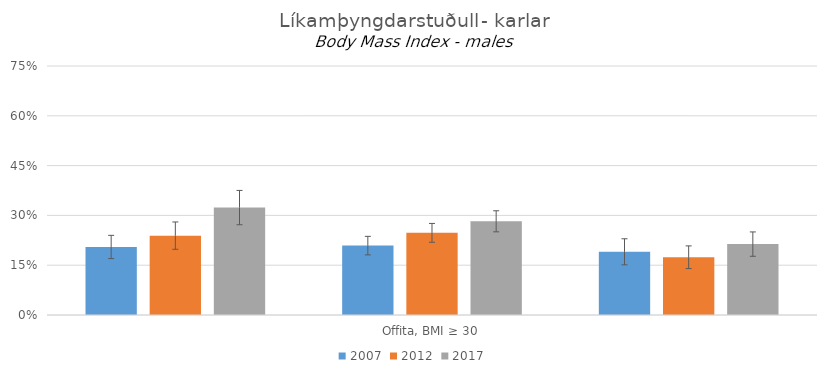
| Category | 2007 | 2012 | 2017 |
|---|---|---|---|
| 0 | 0.205 | 0.239 | 0.324 |
| 1 | 0.209 | 0.247 | 0.282 |
| 2 | 0.19 | 0.174 | 0.214 |